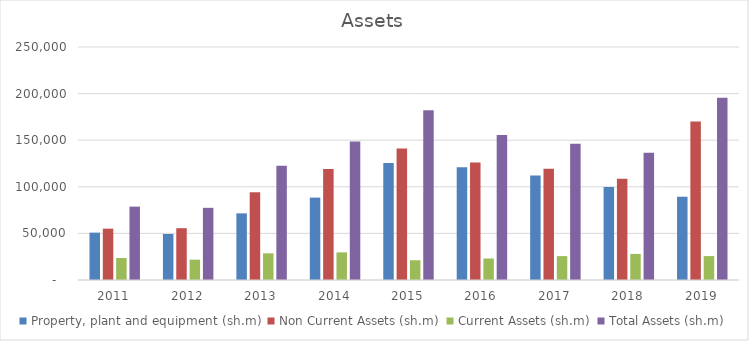
| Category | Property, plant and equipment (sh.m) | Non Current Assets (sh.m) | Current Assets (sh.m) | Total Assets (sh.m) |
|---|---|---|---|---|
| 2011 | 50794 | 55095 | 23617 | 78712 |
| 2012 | 49373 | 55599 | 21833 | 77432 |
| 2013 | 71502 | 94088 | 28608 | 122696 |
| 2014 | 88389 | 119021 | 29636 | 148657 |
| 2015 | 125422 | 141011 | 21205 | 182063 |
| 2016 | 120871 | 125975 | 23051 | 155685 |
| 2017 | 112054 | 119397 | 25632 | 146144 |
| 2018 | 99835 | 108658 | 27976 | 136634 |
| 2019 | 89357 | 170013 | 25660 | 195673 |